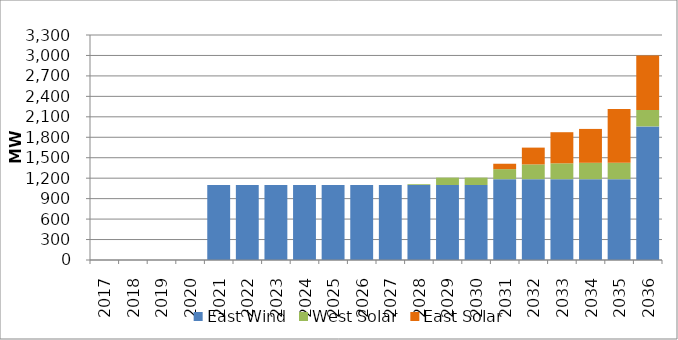
| Category | East Wind | West Solar | East Solar |
|---|---|---|---|
| 2017.0 | 0 | 0 | 0 |
| 2018.0 | 0 | 0 | 0 |
| 2019.0 | 0 | 0 | 0 |
| 2020.0 | 0 | 0 | 0 |
| 2021.0 | 1100 | 0 | 0 |
| 2022.0 | 1100 | 0 | 0 |
| 2023.0 | 1100 | 0 | 0 |
| 2024.0 | 1100 | 0 | 0 |
| 2025.0 | 1100 | 0 | 0 |
| 2026.0 | 1100 | 0 | 0 |
| 2027.0 | 1100 | 0 | 0 |
| 2028.0 | 1100 | 11.44 | 0 |
| 2029.0 | 1100 | 108.315 | 0 |
| 2030.0 | 1100 | 108.315 | 0 |
| 2031.0 | 1185.499 | 146.801 | 79.44 |
| 2032.0 | 1185.499 | 216.806 | 246.065 |
| 2033.0 | 1185.499 | 232.66 | 456.056 |
| 2034.0 | 1185.499 | 240.172 | 496.835 |
| 2035.0 | 1185.499 | 240.172 | 787.411 |
| 2036.0 | 1959.487 | 240.172 | 800 |